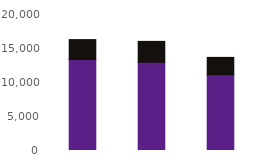
| Category | Online | Telephony |
|---|---|---|
| Mar24 | 13376 | 2934 |
| Apr24 | 12971 | 3075 |
| May24 | 11138 | 2554 |